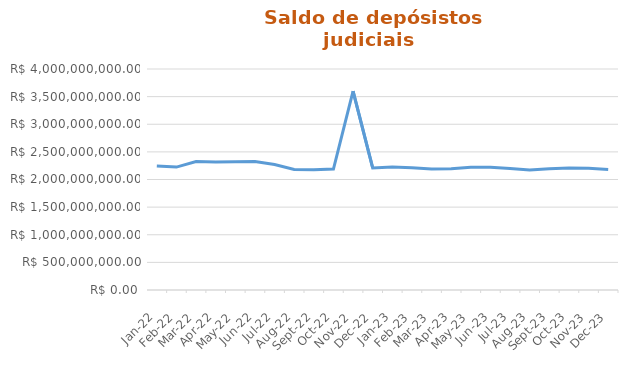
| Category | Depósitos Judiciais |
|---|---|
| 2022-01-01 | 2244164078.73 |
| 2022-02-01 | 2224302842.65 |
| 2022-03-01 | 2324533291.5 |
| 2022-04-01 | 2318742414.27 |
| 2022-05-01 | 2323433981.15 |
| 2022-06-01 | 2323655824.95 |
| 2022-07-01 | 2269902393.29 |
| 2022-08-01 | 2183146412.2 |
| 2022-09-01 | 2175169165.53 |
| 2022-10-01 | 2187969060 |
| 2022-11-01 | 3600351507.26 |
| 2022-12-01 | 2210193691.69 |
| 2023-01-01 | 2228025933.02 |
| 2023-02-01 | 2211773634.91 |
| 2023-03-01 | 2188703914.27 |
| 2023-04-01 | 2194370013.09 |
| 2023-05-01 | 2219508825.14 |
| 2023-06-01 | 2222882852.73 |
| 2023-07-01 | 2198361653.33 |
| 2023-08-01 | 2171137485.96 |
| 2023-09-01 | 2193678210.68 |
| 2023-10-01 | 2210181600.95 |
| 2023-11-01 | 2201590155.84 |
| 2023-12-01 | 2181015494.86 |